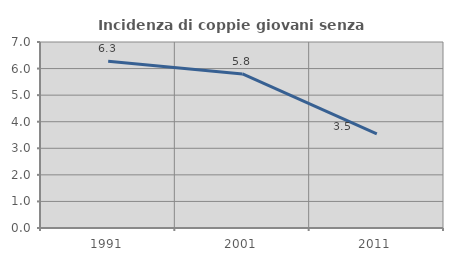
| Category | Incidenza di coppie giovani senza figli |
|---|---|
| 1991.0 | 6.276 |
| 2001.0 | 5.796 |
| 2011.0 | 3.541 |